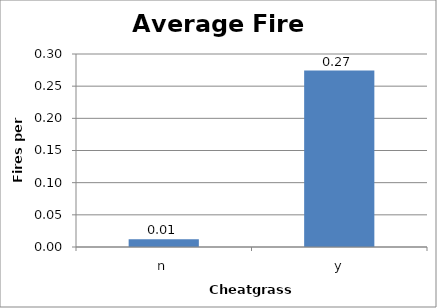
| Category | Series 0 |
|---|---|
| n | 0.012 |
| y | 0.274 |